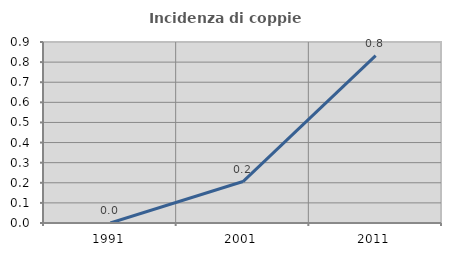
| Category | Incidenza di coppie miste |
|---|---|
| 1991.0 | 0 |
| 2001.0 | 0.206 |
| 2011.0 | 0.832 |